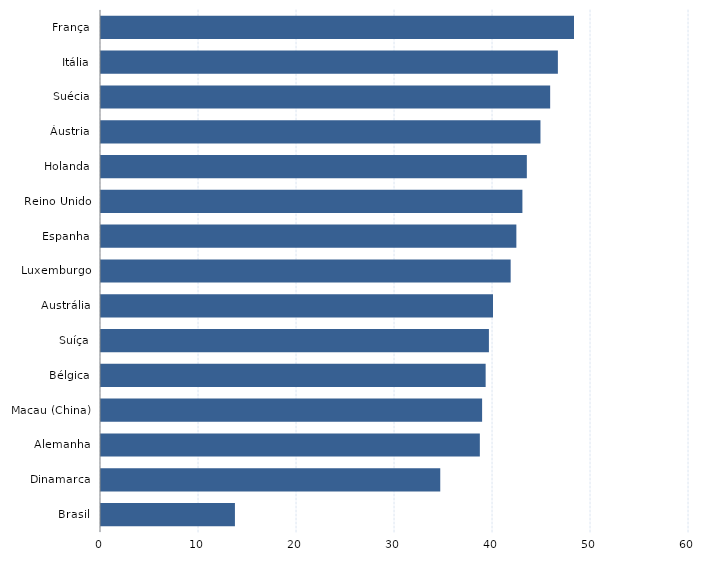
| Category | Series 0 |
|---|---|
| Brasil | 13.666 |
| Dinamarca | 34.618 |
| Alemanha | 38.657 |
| Macau (China) | 38.889 |
| Bélgica | 39.25 |
| Suíça | 39.583 |
| Austrália | 40 |
| Luxemburgo | 41.802 |
| Espanha | 42.384 |
| Reino Unido | 43.001 |
| Holanda | 43.453 |
| Áustria | 44.843 |
| Suécia | 45.833 |
| Itália | 46.62 |
| França | 48.266 |